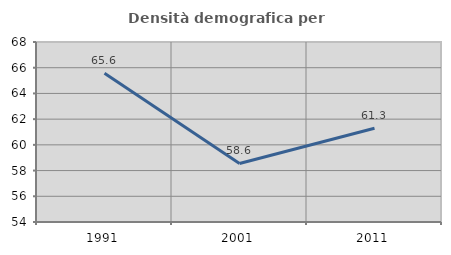
| Category | Densità demografica |
|---|---|
| 1991.0 | 65.573 |
| 2001.0 | 58.551 |
| 2011.0 | 61.297 |